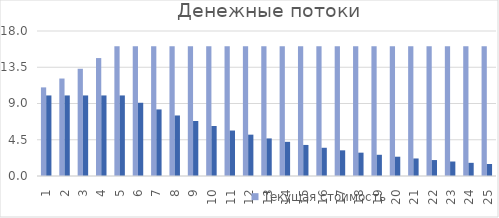
| Category | Текущая стоимость | Дисконтированная стоимость |
|---|---|---|
| 1 | 11 | 10 |
| 2 | 12.1 | 10 |
| 3 | 13.31 | 10 |
| 4 | 14.641 | 10 |
| 5 | 16.105 | 10 |
| 6 | 16.105 | 9.091 |
| 7 | 16.105 | 8.264 |
| 8 | 16.105 | 7.513 |
| 9 | 16.105 | 6.83 |
| 10 | 16.105 | 6.209 |
| 11 | 16.105 | 5.645 |
| 12 | 16.105 | 5.132 |
| 13 | 16.105 | 4.665 |
| 14 | 16.105 | 4.241 |
| 15 | 16.105 | 3.855 |
| 16 | 16.105 | 3.505 |
| 17 | 16.105 | 3.186 |
| 18 | 16.105 | 2.897 |
| 19 | 16.105 | 2.633 |
| 20 | 16.105 | 2.394 |
| 21 | 16.105 | 2.176 |
| 22 | 16.105 | 1.978 |
| 23 | 16.105 | 1.799 |
| 24 | 16.105 | 1.635 |
| 25 | 16.105 | 1.486 |